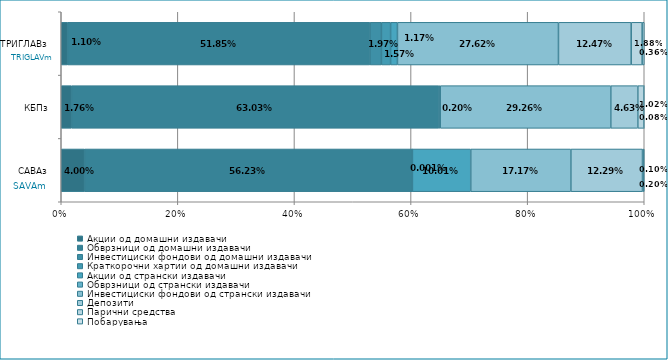
| Category | Акции од домашни издавачи  | Обврзници од домашни издавачи  | Инвестициски фондови од домашни издавачи  | Краткорочни хартии од домашни издавачи  | Акции од странски издавачи  | Обврзници од странски издавачи  | Инвестициски фондови од странски издавaчи | Депозити  | Парични средства  | Побарувања |
|---|---|---|---|---|---|---|---|---|---|---|
| САВАз | 0.04 | 0.562 | 0 | 0 | 0.1 | 0 | 0.172 | 0.123 | 0.001 | 0.002 |
| КБПз | 0.018 | 0.63 | 0.002 | 0 | 0 | 0 | 0.293 | 0.046 | 0.01 | 0.001 |
| ТРИГЛАВз | 0.011 | 0.519 | 0.02 | 0.016 | 0.012 | 0 | 0.276 | 0.125 | 0.019 | 0.004 |